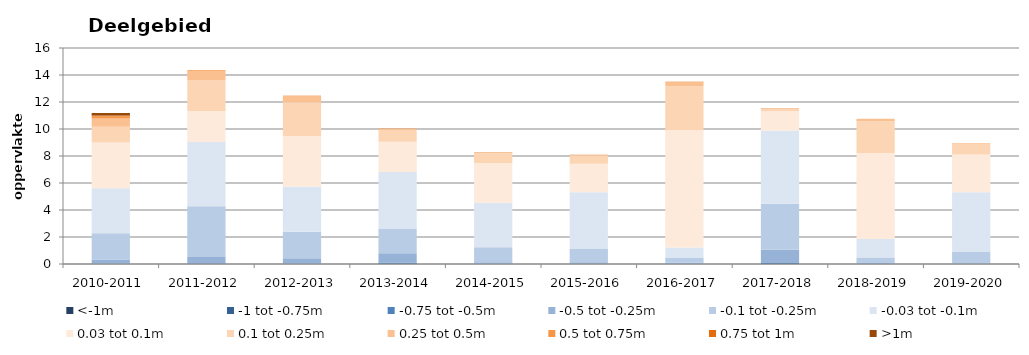
| Category | <-1m | -1 tot -0.75m | -0.75 tot -0.5m | -0.5 tot -0.25m | -0.1 tot -0.25m | -0.03 tot -0.1m | 0.03 tot 0.1m | 0.1 tot 0.25m | 0.25 tot 0.5m | 0.5 tot 0.75m | 0.75 tot 1m | >1m |
|---|---|---|---|---|---|---|---|---|---|---|---|---|
| 2010-2011 | 0.001 | 0.003 | 0.018 | 0.312 | 1.947 | 3.325 | 3.388 | 1.169 | 0.624 | 0.153 | 0.053 | 0.19 |
| 2011-2012 | 0 | 0.004 | 0.04 | 0.468 | 3.772 | 4.746 | 2.304 | 2.279 | 0.684 | 0.051 | 0.007 | 0.001 |
| 2012-2013 | 0 | 0.001 | 0.021 | 0.397 | 1.965 | 3.35 | 3.743 | 2.503 | 0.48 | 0.023 | 0.003 | 0 |
| 2013-2014 | 0.004 | 0.009 | 0.094 | 0.69 | 1.829 | 4.184 | 2.238 | 0.879 | 0.096 | 0.008 | 0 | 0 |
| 2014-2015 | 0 | 0.002 | 0.004 | 0.124 | 1.116 | 3.287 | 2.944 | 0.724 | 0.062 | 0.005 | 0.001 | 0 |
| 2015-2016 | 0.01 | 0.004 | 0.011 | 0.099 | 0.98 | 4.217 | 2.106 | 0.615 | 0.066 | 0.005 | 0 | 0 |
| 2016-2017 | 0 | 0.001 | 0.008 | 0.078 | 0.357 | 0.774 | 8.682 | 3.258 | 0.302 | 0.025 | 0.007 | 0.011 |
| 2017-2018 | 0 | 0.004 | 0.067 | 0.98 | 3.411 | 5.418 | 1.436 | 0.181 | 0.024 | 0.006 | 0.001 | 0 |
| 2018-2019 | 0 | 0.001 | 0.006 | 0.063 | 0.417 | 1.369 | 6.363 | 2.35 | 0.189 | 0.004 | 0.001 | 0 |
| 2019-2020 | 0 | 0 | 0.002 | 0.059 | 0.869 | 4.388 | 2.8 | 0.77 | 0.052 | 0.001 | 0 | 0 |